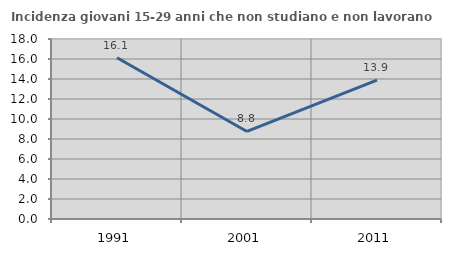
| Category | Incidenza giovani 15-29 anni che non studiano e non lavorano  |
|---|---|
| 1991.0 | 16.124 |
| 2001.0 | 8.754 |
| 2011.0 | 13.889 |